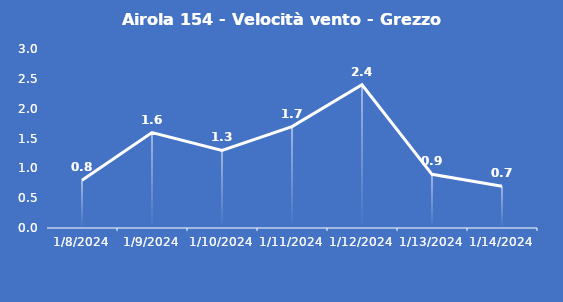
| Category | Airola 154 - Velocità vento - Grezzo (m/s) |
|---|---|
| 1/8/24 | 0.8 |
| 1/9/24 | 1.6 |
| 1/10/24 | 1.3 |
| 1/11/24 | 1.7 |
| 1/12/24 | 2.4 |
| 1/13/24 | 0.9 |
| 1/14/24 | 0.7 |